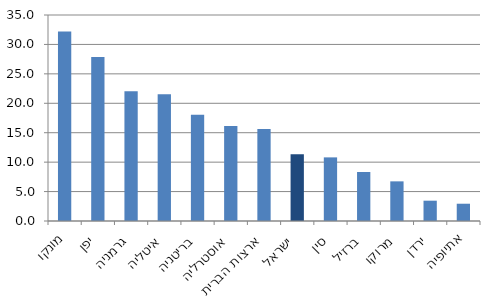
| Category | Series 0 |
|---|---|
| מונקו | 32.208 |
| יפן | 27.872 |
| גרמניה | 22.061 |
| איטליה | 21.53 |
| בריטניה | 18.043 |
| אוסטרליה | 16.142 |
| ארצות הברית | 15.631 |
| ישראל | 11.326 |
| סין | 10.81 |
| ברזיל | 8.328 |
| מרוקו | 6.735 |
| ירדן | 3.451 |
| אתיופיה | 2.936 |